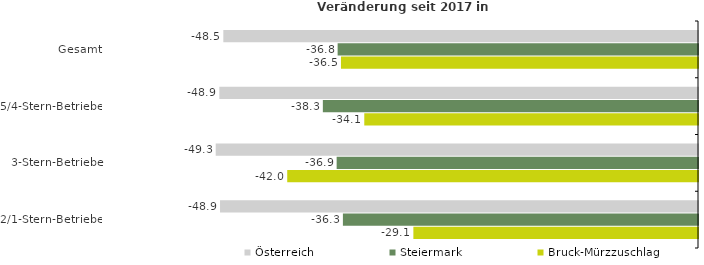
| Category | Österreich | Steiermark | Bruck-Mürzzuschlag |
|---|---|---|---|
| Gesamt | -48.519 | -36.835 | -36.494 |
| 5/4-Stern-Betriebe | -48.928 | -38.346 | -34.111 |
| 3-Stern-Betriebe | -49.297 | -36.936 | -41.988 |
| 2/1-Stern-Betriebe | -48.857 | -36.296 | -29.093 |